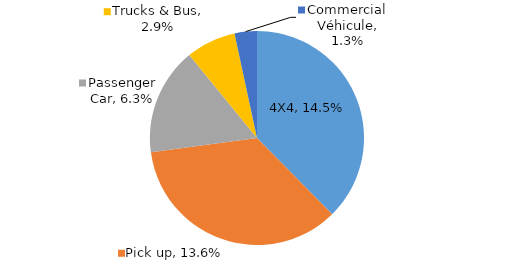
| Category | Series 0 |
|---|---|
| 4X4 | 0.145 |
| Pick up | 0.136 |
| Passenger Car | 0.062 |
| Trucks & Bus | 0.029 |
| Commercial Véhicule | 0.013 |